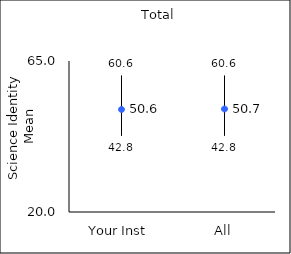
| Category | 25th percentile | 75th percentile | Mean |
|---|---|---|---|
| Your Inst | 42.8 | 60.6 | 50.55 |
| All | 42.8 | 60.6 | 50.7 |